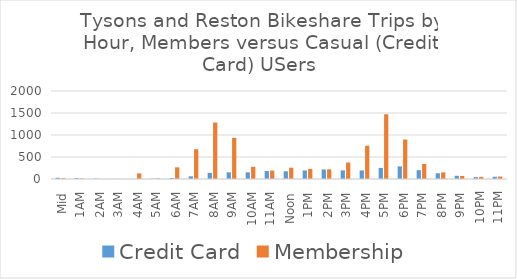
| Category | Credit Card | Membership |
|---|---|---|
| Mid | 28 | 20 |
| 1AM | 21 | 13 |
| 2AM | 8 | 2 |
| 3AM | 3 | 0 |
| 4AM | 0 | 128 |
| 5AM | 7 | 14 |
| 6AM | 24 | 265 |
| 7AM | 61 | 677 |
| 8AM | 140 | 1284 |
| 9AM | 152 | 935 |
| 10AM | 151 | 277 |
| 11AM | 181 | 192 |
| Noon | 175 | 257 |
| 1PM | 195 | 230 |
| 2PM | 218 | 220 |
| 3PM | 195 | 374 |
| 4PM | 195 | 756 |
| 5PM | 252 | 1471 |
| 6PM | 287 | 898 |
| 7PM | 201 | 343 |
| 8PM | 130 | 150 |
| 9PM | 73 | 69 |
| 10PM | 42 | 49 |
| 11PM | 51 | 56 |